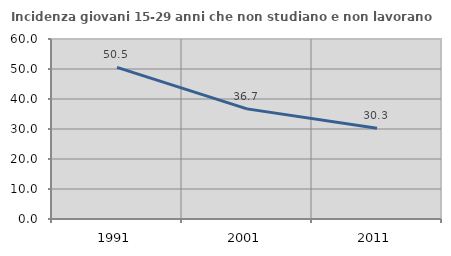
| Category | Incidenza giovani 15-29 anni che non studiano e non lavorano  |
|---|---|
| 1991.0 | 50.538 |
| 2001.0 | 36.711 |
| 2011.0 | 30.275 |